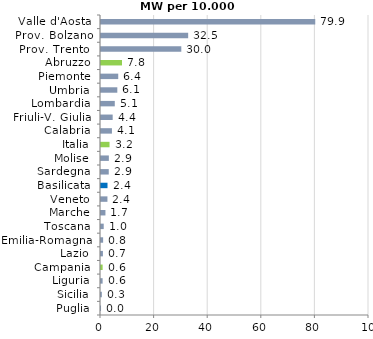
| Category | Series 0 |
|---|---|
| Puglia | 0.009 |
| Sicilia | 0.309 |
| Liguria | 0.605 |
| Campania | 0.607 |
| Lazio | 0.714 |
| Emilia-Romagna | 0.79 |
| Toscana | 1.015 |
| Marche | 1.657 |
| Veneto | 2.403 |
| Basilicata | 2.427 |
| Sardegna | 2.894 |
| Molise | 2.932 |
| Italia | 3.183 |
| Calabria | 4.08 |
| Friuli-V. Giulia | 4.358 |
| Lombardia | 5.144 |
| Umbria | 6.087 |
| Piemonte | 6.431 |
| Abruzzo | 7.829 |
| Prov. Trento  | 29.966 |
| Prov. Bolzano | 32.525 |
| Valle d'Aosta | 79.946 |